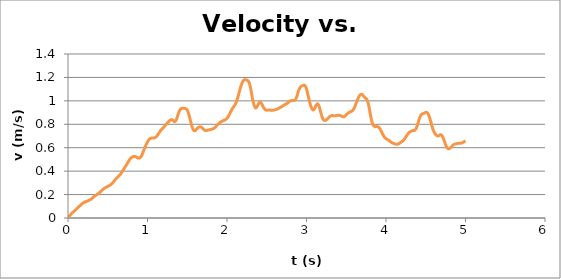
| Category | Series 0 |
|---|---|
| 0.0 | 0 |
| 0.02 | 0.018 |
| 0.04 | 0.034 |
| 0.06 | 0.048 |
| 0.08 | 0.06 |
| 0.1 | 0.072 |
| 0.12 | 0.085 |
| 0.14 | 0.098 |
| 0.16 | 0.111 |
| 0.18 | 0.122 |
| 0.2 | 0.133 |
| 0.22 | 0.139 |
| 0.24 | 0.144 |
| 0.26 | 0.15 |
| 0.28 | 0.156 |
| 0.3 | 0.166 |
| 0.32 | 0.179 |
| 0.34 | 0.189 |
| 0.36 | 0.198 |
| 0.38 | 0.208 |
| 0.4 | 0.219 |
| 0.42 | 0.231 |
| 0.44 | 0.244 |
| 0.46 | 0.255 |
| 0.48 | 0.262 |
| 0.5 | 0.27 |
| 0.52 | 0.278 |
| 0.54 | 0.286 |
| 0.56 | 0.298 |
| 0.58 | 0.315 |
| 0.6 | 0.332 |
| 0.62 | 0.346 |
| 0.64 | 0.36 |
| 0.66 | 0.374 |
| 0.68 | 0.394 |
| 0.7 | 0.416 |
| 0.72 | 0.438 |
| 0.74 | 0.46 |
| 0.76 | 0.482 |
| 0.78 | 0.503 |
| 0.8 | 0.518 |
| 0.82 | 0.525 |
| 0.84 | 0.525 |
| 0.86 | 0.52 |
| 0.88 | 0.513 |
| 0.9 | 0.512 |
| 0.92 | 0.524 |
| 0.94 | 0.554 |
| 0.96 | 0.59 |
| 0.98 | 0.622 |
| 1.0 | 0.649 |
| 1.02 | 0.67 |
| 1.04 | 0.68 |
| 1.06 | 0.682 |
| 1.08 | 0.683 |
| 1.1 | 0.688 |
| 1.12 | 0.702 |
| 1.14 | 0.721 |
| 1.16 | 0.742 |
| 1.18 | 0.758 |
| 1.2 | 0.772 |
| 1.22 | 0.787 |
| 1.24 | 0.804 |
| 1.26 | 0.82 |
| 1.28 | 0.831 |
| 1.3 | 0.84 |
| 1.32 | 0.834 |
| 1.34 | 0.822 |
| 1.36 | 0.835 |
| 1.38 | 0.874 |
| 1.4 | 0.913 |
| 1.42 | 0.932 |
| 1.44 | 0.937 |
| 1.46 | 0.936 |
| 1.48 | 0.934 |
| 1.5 | 0.921 |
| 1.52 | 0.885 |
| 1.54 | 0.831 |
| 1.56 | 0.779 |
| 1.58 | 0.749 |
| 1.6 | 0.746 |
| 1.62 | 0.76 |
| 1.64 | 0.773 |
| 1.66 | 0.779 |
| 1.68 | 0.774 |
| 1.7 | 0.761 |
| 1.72 | 0.749 |
| 1.74 | 0.746 |
| 1.76 | 0.75 |
| 1.78 | 0.753 |
| 1.8 | 0.756 |
| 1.82 | 0.76 |
| 1.84 | 0.767 |
| 1.86 | 0.781 |
| 1.88 | 0.796 |
| 1.9 | 0.808 |
| 1.92 | 0.818 |
| 1.94 | 0.827 |
| 1.96 | 0.833 |
| 1.98 | 0.839 |
| 2.0 | 0.851 |
| 2.02 | 0.871 |
| 2.04 | 0.898 |
| 2.06 | 0.926 |
| 2.08 | 0.946 |
| 2.1 | 0.965 |
| 2.12 | 0.995 |
| 2.14 | 1.039 |
| 2.16 | 1.09 |
| 2.18 | 1.135 |
| 2.2 | 1.167 |
| 2.22 | 1.181 |
| 2.24 | 1.179 |
| 2.26 | 1.174 |
| 2.28 | 1.154 |
| 2.3 | 1.096 |
| 2.32 | 1.022 |
| 2.34 | 0.966 |
| 2.36 | 0.939 |
| 2.38 | 0.952 |
| 2.4 | 0.981 |
| 2.42 | 0.988 |
| 2.44 | 0.97 |
| 2.46 | 0.944 |
| 2.48 | 0.926 |
| 2.5 | 0.921 |
| 2.52 | 0.922 |
| 2.54 | 0.921 |
| 2.56 | 0.92 |
| 2.58 | 0.92 |
| 2.6 | 0.923 |
| 2.62 | 0.927 |
| 2.64 | 0.933 |
| 2.66 | 0.94 |
| 2.68 | 0.947 |
| 2.7 | 0.956 |
| 2.72 | 0.965 |
| 2.74 | 0.972 |
| 2.76 | 0.981 |
| 2.78 | 0.992 |
| 2.8 | 1 |
| 2.82 | 1.004 |
| 2.84 | 1.003 |
| 2.86 | 1.009 |
| 2.88 | 1.041 |
| 2.9 | 1.086 |
| 2.92 | 1.115 |
| 2.94 | 1.126 |
| 2.96 | 1.132 |
| 2.98 | 1.131 |
| 3.0 | 1.102 |
| 3.02 | 1.046 |
| 3.04 | 0.989 |
| 3.06 | 0.945 |
| 3.08 | 0.922 |
| 3.1 | 0.931 |
| 3.12 | 0.961 |
| 3.14 | 0.976 |
| 3.16 | 0.95 |
| 3.18 | 0.9 |
| 3.2 | 0.855 |
| 3.22 | 0.833 |
| 3.24 | 0.834 |
| 3.26 | 0.845 |
| 3.28 | 0.859 |
| 3.3 | 0.87 |
| 3.32 | 0.875 |
| 3.34 | 0.873 |
| 3.36 | 0.872 |
| 3.38 | 0.875 |
| 3.4 | 0.877 |
| 3.42 | 0.876 |
| 3.44 | 0.869 |
| 3.46 | 0.864 |
| 3.48 | 0.867 |
| 3.5 | 0.88 |
| 3.52 | 0.894 |
| 3.54 | 0.903 |
| 3.56 | 0.909 |
| 3.58 | 0.917 |
| 3.6 | 0.937 |
| 3.62 | 0.972 |
| 3.64 | 1.008 |
| 3.66 | 1.037 |
| 3.68 | 1.054 |
| 3.7 | 1.054 |
| 3.72 | 1.038 |
| 3.74 | 1.024 |
| 3.76 | 1.011 |
| 3.78 | 0.97 |
| 3.8 | 0.898 |
| 3.82 | 0.828 |
| 3.84 | 0.792 |
| 3.86 | 0.781 |
| 3.88 | 0.78 |
| 3.9 | 0.779 |
| 3.92 | 0.766 |
| 3.94 | 0.741 |
| 3.96 | 0.713 |
| 3.98 | 0.69 |
| 4.0 | 0.677 |
| 4.02 | 0.67 |
| 4.04 | 0.661 |
| 4.06 | 0.65 |
| 4.08 | 0.641 |
| 4.1 | 0.636 |
| 4.12 | 0.631 |
| 4.14 | 0.629 |
| 4.16 | 0.634 |
| 4.18 | 0.643 |
| 4.2 | 0.652 |
| 4.22 | 0.664 |
| 4.24 | 0.681 |
| 4.26 | 0.703 |
| 4.28 | 0.721 |
| 4.3 | 0.734 |
| 4.32 | 0.743 |
| 4.34 | 0.746 |
| 4.36 | 0.748 |
| 4.38 | 0.765 |
| 4.4 | 0.804 |
| 4.42 | 0.85 |
| 4.44 | 0.88 |
| 4.46 | 0.89 |
| 4.48 | 0.894 |
| 4.5 | 0.902 |
| 4.52 | 0.898 |
| 4.54 | 0.874 |
| 4.56 | 0.83 |
| 4.58 | 0.779 |
| 4.6 | 0.74 |
| 4.62 | 0.717 |
| 4.64 | 0.702 |
| 4.66 | 0.701 |
| 4.68 | 0.709 |
| 4.7 | 0.707 |
| 4.72 | 0.682 |
| 4.74 | 0.643 |
| 4.76 | 0.609 |
| 4.78 | 0.592 |
| 4.8 | 0.593 |
| 4.82 | 0.606 |
| 4.84 | 0.62 |
| 4.86 | 0.629 |
| 4.88 | 0.634 |
| 4.9 | 0.637 |
| 4.92 | 0.638 |
| 4.94 | 0.639 |
| 4.96 | 0.642 |
| 4.98 | 0.65 |
| 5.0 | 0.659 |